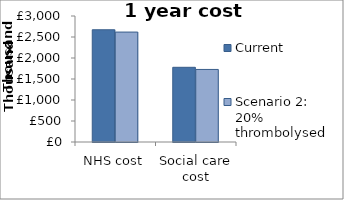
| Category | Current  | Scenario 2: 20% thrombolysed |
|---|---|---|
| NHS cost | 2672500 | 2617500 |
| Social care cost | 1778600 | 1727400 |